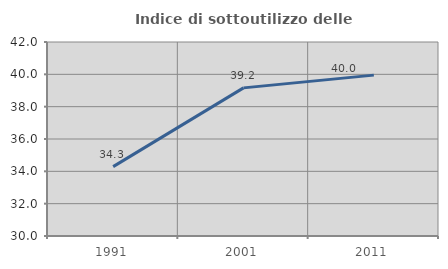
| Category | Indice di sottoutilizzo delle abitazioni  |
|---|---|
| 1991.0 | 34.293 |
| 2001.0 | 39.163 |
| 2011.0 | 39.951 |